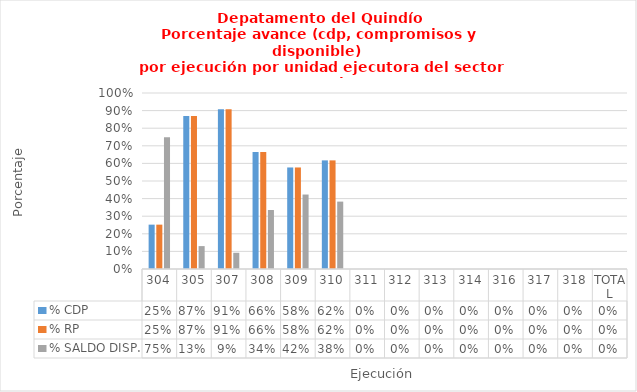
| Category | % CDP | % RP | % SALDO DISP. |
|---|---|---|---|
| 304 | 0.252 | 0.252 | 0.748 |
| 305 | 0.87 | 0.87 | 0.13 |
| 307 | 0.908 | 0.908 | 0.092 |
| 308 | 0.665 | 0.665 | 0.335 |
| 309 | 0.577 | 0.577 | 0.423 |
| 310 | 0.617 | 0.617 | 0.383 |
| 311 | 0 | 0 | 0 |
| 312 | 0 | 0 | 0 |
| 313 | 0 | 0 | 0 |
| 314 | 0 | 0 | 0 |
| 316 | 0 | 0 | 0 |
| 317 | 0 | 0 | 0 |
| 318 | 0 | 0 | 0 |
| TOTAL | 0 | 0 | 0 |